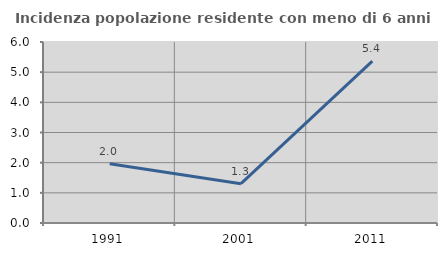
| Category | Incidenza popolazione residente con meno di 6 anni |
|---|---|
| 1991.0 | 1.961 |
| 2001.0 | 1.302 |
| 2011.0 | 5.366 |